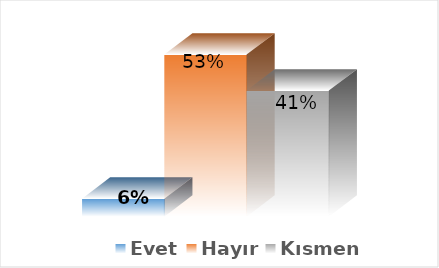
| Category | Evet | Hayır | Kısmen |
|---|---|---|---|
| 0 | 0.059 | 0.529 | 0.412 |